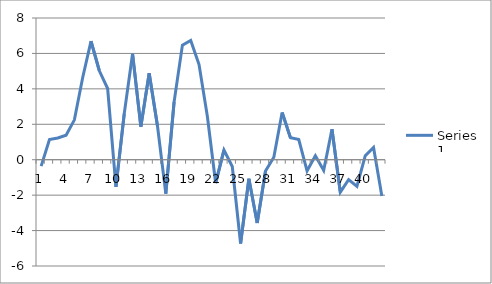
| Category | Series 0 |
|---|---|
| 0 | -0.364 |
| 1 | 1.136 |
| 2 | 1.23 |
| 3 | 1.383 |
| 4 | 2.25 |
| 5 | 4.641 |
| 6 | 6.692 |
| 7 | 5.021 |
| 8 | 4.019 |
| 9 | -1.531 |
| 10 | 2.605 |
| 11 | 5.978 |
| 12 | 1.867 |
| 13 | 4.879 |
| 14 | 1.904 |
| 15 | -1.917 |
| 16 | 3.266 |
| 17 | 6.467 |
| 18 | 6.729 |
| 19 | 5.375 |
| 20 | 2.45 |
| 21 | -1.316 |
| 22 | 0.544 |
| 23 | -0.382 |
| 24 | -4.729 |
| 25 | -1.077 |
| 26 | -3.57 |
| 27 | -0.637 |
| 28 | 0.139 |
| 29 | 2.667 |
| 30 | 1.245 |
| 31 | 1.142 |
| 32 | -0.63 |
| 33 | 0.222 |
| 34 | -0.602 |
| 35 | 1.719 |
| 36 | -1.835 |
| 37 | -1.125 |
| 38 | -1.503 |
| 39 | 0.216 |
| 40 | 0.693 |
| 41 | -2.047 |